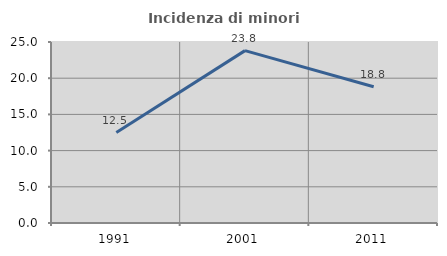
| Category | Incidenza di minori stranieri |
|---|---|
| 1991.0 | 12.5 |
| 2001.0 | 23.81 |
| 2011.0 | 18.812 |